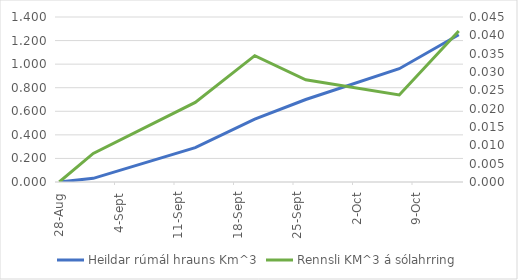
| Category | Heildar rúmál hrauns Km^3 |
|---|---|
| 2014-08-28 | 0 |
| 2014-09-01 | 0.031 |
| 2014-09-13 | 0.292 |
| 2014-09-20 | 0.533 |
| 2014-09-26 | 0.7 |
| 2014-10-07 | 0.961 |
| 2014-10-14 | 1.249 |